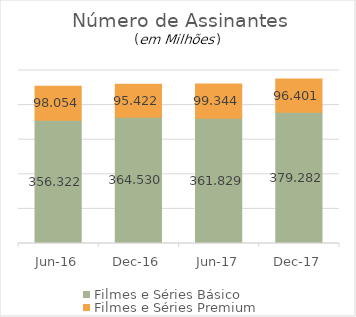
| Category | Filmes e Séries Básico | Filmes e Séries Premium |
|---|---|---|
| 2016-06-01 | 356321722.467 | 98053689 |
| 2016-12-01 | 364529780.832 | 95422260 |
| 2017-06-01 | 361828518.086 | 99344223.439 |
| 2017-12-01 | 379281518.515 | 96401454.664 |